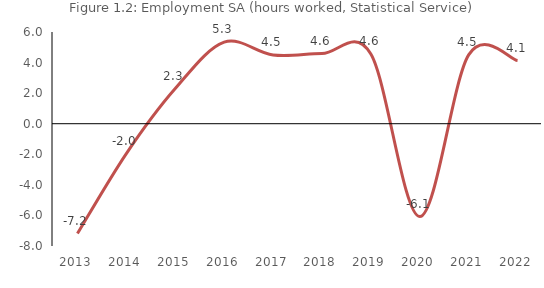
| Category | Employment SA (hours worked, Statistical Service) |
|---|---|
| 2013.0 | -7.187 |
| 2014.0 | -1.954 |
| 2015.0 | 2.299 |
| 2016.0 | 5.333 |
| 2017.0 | 4.494 |
| 2018.0 | 4.589 |
| 2019.0 | 4.555 |
| 2020.0 | -6.078 |
| 2021.0 | 4.502 |
| 2022.0 | 4.131 |